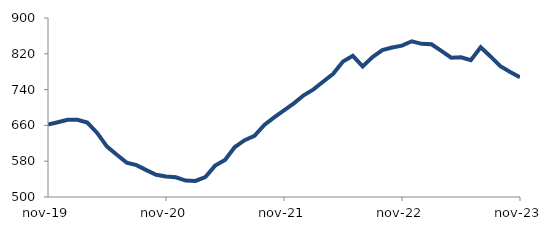
| Category | Series 0 |
|---|---|
| 2019-11-01 | 662.174 |
| 2019-12-01 | 667.143 |
| 2020-01-01 | 672.455 |
| 2020-02-01 | 672.659 |
| 2020-03-01 | 666.213 |
| 2020-04-01 | 643.145 |
| 2020-05-01 | 612.572 |
| 2020-06-01 | 594.292 |
| 2020-07-01 | 576.858 |
| 2020-08-01 | 571.224 |
| 2020-09-01 | 560.032 |
| 2020-10-01 | 549.541 |
| 2020-11-01 | 545.982 |
| 2020-12-01 | 544.038 |
| 2021-01-01 | 536.772 |
| 2021-02-01 | 535.938 |
| 2021-03-01 | 544.717 |
| 2021-04-01 | 570.16 |
| 2021-05-01 | 582.981 |
| 2021-06-01 | 611.684 |
| 2021-07-01 | 627.037 |
| 2021-08-01 | 636.642 |
| 2021-09-01 | 661.114 |
| 2021-10-01 | 677.889 |
| 2021-11-01 | 693.389 |
| 2021-12-01 | 709.343 |
| 2022-01-01 | 727.31 |
| 2022-02-01 | 740.539 |
| 2022-03-01 | 758.027 |
| 2022-04-01 | 775.241 |
| 2022-05-01 | 802.956 |
| 2022-06-01 | 815.434 |
| 2022-07-01 | 791.89 |
| 2022-08-01 | 812.76 |
| 2022-09-01 | 828.12 |
| 2022-10-01 | 834 |
| 2022-11-01 | 838.178 |
| 2022-12-01 | 847.954 |
| 2023-01-01 | 842.285 |
| 2023-02-01 | 841.25 |
| 2023-03-01 | 826.38 |
| 2023-04-01 | 811.394 |
| 2023-05-01 | 812.228 |
| 2023-06-01 | 805.926 |
| 2023-07-01 | 834.815 |
| 2023-08-01 | 814.103 |
| 2023-09-01 | 792.442 |
| 2023-10-01 | 779.206 |
| 2023-11-01 | 767.605 |